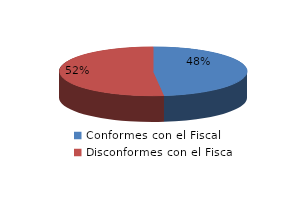
| Category | Series 0 |
|---|---|
| 0 | 13 |
| 1 | 14 |